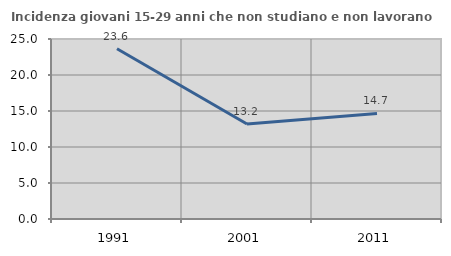
| Category | Incidenza giovani 15-29 anni che non studiano e non lavorano  |
|---|---|
| 1991.0 | 23.644 |
| 2001.0 | 13.193 |
| 2011.0 | 14.658 |